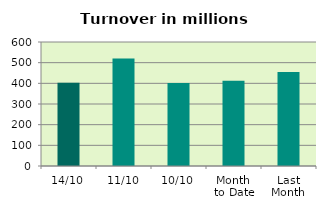
| Category | Series 0 |
|---|---|
| 14/10 | 403.425 |
| 11/10 | 520.637 |
| 10/10 | 401.527 |
| Month 
to Date | 412.879 |
| Last
Month | 454.566 |